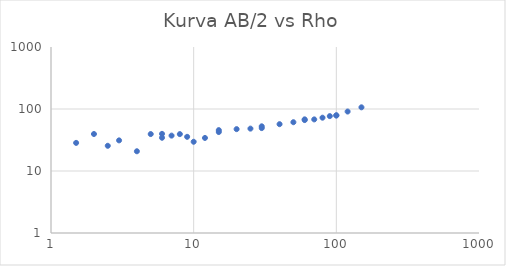
| Category | Series 0 |
|---|---|
| 1.5 | 28.412 |
| 2.0 | 39.496 |
| 2.5 | 25.499 |
| 3.0 | 31.185 |
| 4.0 | 20.81 |
| 5.0 | 39.416 |
| 6.0 | 34.371 |
| 6.0 | 39.716 |
| 7.0 | 37.21 |
| 8.0 | 39.352 |
| 9.0 | 35.576 |
| 10.0 | 29.621 |
| 12.0 | 34.133 |
| 15.0 | 42.486 |
| 15.0 | 45.655 |
| 20.0 | 47.333 |
| 25.0 | 48.255 |
| 30.0 | 49.198 |
| 30.0 | 52.584 |
| 40.0 | 56.9 |
| 50.0 | 61.21 |
| 60.0 | 68.09 |
| 60.0 | 66.302 |
| 70.0 | 67.956 |
| 80.0 | 72.412 |
| 90.0 | 76.774 |
| 100.0 | 78.446 |
| 100.0 | 79.175 |
| 120.0 | 91.009 |
| 150.0 | 106.445 |